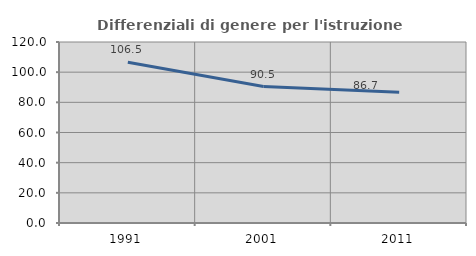
| Category | Differenziali di genere per l'istruzione superiore |
|---|---|
| 1991.0 | 106.545 |
| 2001.0 | 90.487 |
| 2011.0 | 86.743 |